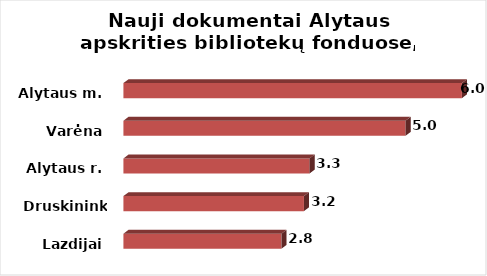
| Category | Series 0 |
|---|---|
| Lazdijai | 2.8 |
| Druskininkai | 3.2 |
| Alytaus r. | 3.3 |
| Varėna | 5 |
| Alytaus m. | 6 |